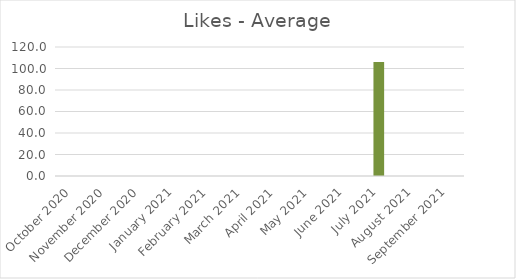
| Category | Average |
|---|---|
| October 2020 | 0 |
| November 2020 | 0 |
| December 2020 | 0 |
| January 2021 | 0 |
| February 2021 | 0 |
| March 2021 | 0 |
| April 2021 | 0 |
| May 2021 | 0 |
| June 2021 | 0 |
| July 2021 | 105.981 |
| August 2021 | 0 |
| September 2021 | 0 |